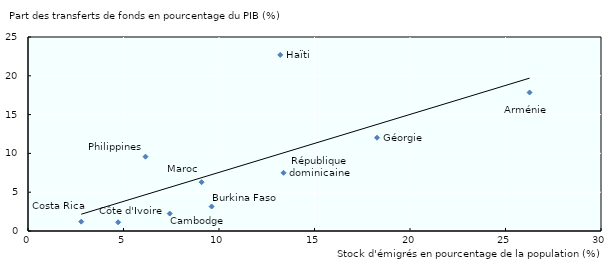
| Category | Part des transferts de fonds en pourcentage du PIB en 2014  |
|---|---|
| 26.2596785233033 | 17.851 |
| 9.61449739922974 | 3.156 |
| 7.42032198822116 | 2.246 |
| 2.78841747030076 | 1.199 |
| 4.71923446374585 | 1.123 |
| 13.3786345216531 | 7.5 |
| 18.2725173640069 | 12.017 |
| 13.2071816136304 | 22.691 |
| 9.08843911666764 | 6.293 |
| 6.15106375747814 | 9.577 |